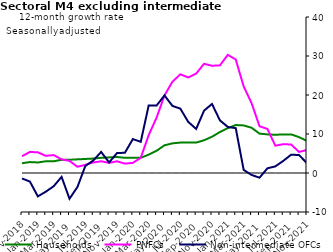
| Category | zero | Households | PNFCs | Non-intermediate OFCs |
|---|---|---|---|---|
| Nov-2018 | 0 | 2.5 | 4.3 | -1.4 |
| Dec-2018 | 0 | 2.8 | 5.4 | -2.2 |
| Jan-2019 | 0 | 2.7 | 5.3 | -6 |
| Feb-2019 | 0 | 3 | 4.4 | -4.8 |
| Mar-2019 | 0 | 3 | 4.6 | -3.4 |
| Apr-2019 | 0 | 3.4 | 3.5 | -1 |
| May-2019 | 0 | 3.4 | 3.1 | -6.6 |
| Jun-2019 | 0 | 3.5 | 1.6 | -3.6 |
| Jul-2019 | 0 | 3.6 | 2.1 | 1.8 |
| Aug-2019 | 0 | 3.7 | 2.7 | 3.2 |
| Sep-2019 | 0 | 3.9 | 3 | 5.4 |
| Oct-2019 | 0 | 4 | 2.6 | 2.7 |
| Nov-2019 | 0 | 4.1 | 3 | 5.1 |
| Dec-2019 | 0 | 3.9 | 2.4 | 5.2 |
| Jan-2020 | 0 | 3.9 | 2.6 | 8.7 |
| Feb-2020 | 0 | 3.9 | 3.9 | 8 |
| Mar-2020 | 0 | 4.7 | 9.7 | 17.3 |
| Apr-2020 | 0 | 5.7 | 14.2 | 17.3 |
| May-2020 | 0 | 7.1 | 19.9 | 19.9 |
| Jun-2020 | 0 | 7.6 | 23.4 | 17.2 |
| Jul-2020 | 0 | 7.8 | 25.3 | 16.5 |
| Aug-2020 | 0 | 7.8 | 24.5 | 13.1 |
| Sep-2020 | 0 | 7.8 | 25.5 | 11.3 |
| Oct-2020 | 0 | 8.4 | 28 | 16 |
| Nov-2020 | 0 | 9.3 | 27.5 | 17.7 |
| Dec-2020 | 0 | 10.5 | 27.6 | 13.5 |
| Jan-2021 | 0 | 11.5 | 30.3 | 11.8 |
| Feb-2021 | 0 | 12.3 | 29.1 | 11.5 |
| Mar-2021 | 0 | 12.2 | 22.2 | 0.8 |
| Apr-2021 | 0 | 11.6 | 17.9 | -0.5 |
| May-2021 | 0 | 10.1 | 12 | -1.2 |
| Jun-2021 | 0 | 9.9 | 11.3 | 1.2 |
| Jul-2021 | 0 | 9.8 | 7 | 1.7 |
| Aug-2021 | 0 | 9.9 | 7.4 | 3.1 |
| Sep-2021 | 0 | 9.9 | 7.3 | 4.7 |
| Oct-2021 | 0 | 9.2 | 5.4 | 4.6 |
| Nov-2021 | 0 | 8.2 | 5.9 | 2.5 |